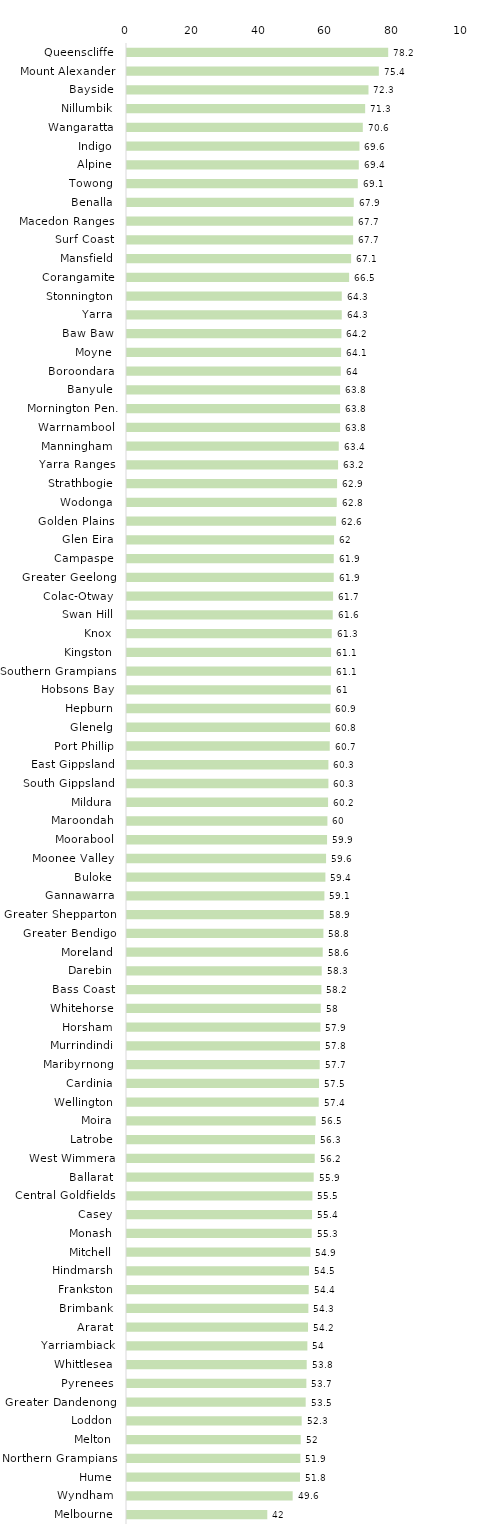
| Category | Series 0 |
|---|---|
| Queenscliffe  | 78.2 |
| Mount Alexander  | 75.4 |
| Bayside  | 72.3 |
| Nillumbik  | 71.3 |
| Wangaratta  | 70.6 |
| Indigo  | 69.6 |
| Alpine  | 69.4 |
| Towong  | 69.1 |
| Benalla  | 67.9 |
| Macedon Ranges  | 67.7 |
| Surf Coast  | 67.7 |
| Mansfield  | 67.1 |
| Corangamite  | 66.5 |
| Stonnington  | 64.3 |
| Yarra  | 64.3 |
| Baw Baw  | 64.2 |
| Moyne  | 64.1 |
| Boroondara  | 64 |
| Banyule  | 63.8 |
| Mornington Pen. | 63.8 |
| Warrnambool  | 63.8 |
| Manningham  | 63.4 |
| Yarra Ranges  | 63.2 |
| Strathbogie  | 62.9 |
| Wodonga  | 62.8 |
| Golden Plains  | 62.6 |
| Glen Eira  | 62 |
| Campaspe  | 61.9 |
| Greater Geelong  | 61.9 |
| Colac-Otway  | 61.7 |
| Swan Hill  | 61.6 |
| Knox  | 61.3 |
| Kingston  | 61.1 |
| Southern Grampians  | 61.1 |
| Hobsons Bay  | 61 |
| Hepburn  | 60.9 |
| Glenelg  | 60.8 |
| Port Phillip  | 60.7 |
| East Gippsland  | 60.3 |
| South Gippsland  | 60.3 |
| Mildura  | 60.2 |
| Maroondah  | 60 |
| Moorabool  | 59.9 |
| Moonee Valley  | 59.6 |
| Buloke  | 59.4 |
| Gannawarra  | 59.1 |
| Greater Shepparton  | 58.9 |
| Greater Bendigo  | 58.8 |
| Moreland  | 58.6 |
| Darebin  | 58.3 |
| Bass Coast  | 58.2 |
| Whitehorse  | 58 |
| Horsham  | 57.9 |
| Murrindindi  | 57.8 |
| Maribyrnong  | 57.7 |
| Cardinia  | 57.5 |
| Wellington  | 57.4 |
| Moira  | 56.5 |
| Latrobe  | 56.3 |
| West Wimmera  | 56.2 |
| Ballarat  | 55.9 |
| Central Goldfields  | 55.5 |
| Casey  | 55.4 |
| Monash  | 55.3 |
| Mitchell  | 54.9 |
| Hindmarsh  | 54.5 |
| Frankston  | 54.4 |
| Brimbank  | 54.3 |
| Ararat  | 54.2 |
| Yarriambiack  | 54 |
| Whittlesea  | 53.8 |
| Pyrenees  | 53.7 |
| Greater Dandenong  | 53.5 |
| Loddon  | 52.3 |
| Melton  | 52 |
| Northern Grampians  | 51.9 |
| Hume  | 51.8 |
| Wyndham  | 49.6 |
| Melbourne  | 42 |